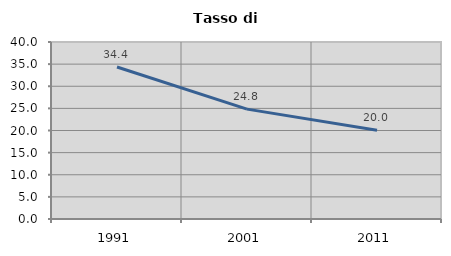
| Category | Tasso di disoccupazione   |
|---|---|
| 1991.0 | 34.36 |
| 2001.0 | 24.834 |
| 2011.0 | 20.043 |